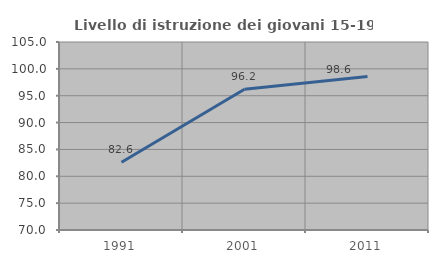
| Category | Livello di istruzione dei giovani 15-19 anni |
|---|---|
| 1991.0 | 82.615 |
| 2001.0 | 96.188 |
| 2011.0 | 98.591 |